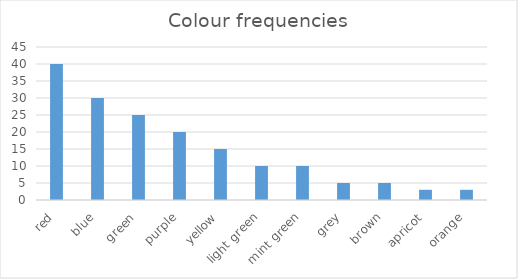
| Category | Series 0 |
|---|---|
| red | 40 |
| blue | 30 |
| green | 25 |
| purple | 20 |
| yellow | 15 |
| light green | 10 |
| mint green | 10 |
| grey | 5 |
| brown | 5 |
| apricot | 3 |
| orange | 3 |